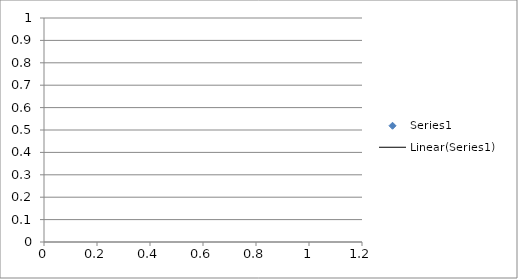
| Category | Series 0 |
|---|---|
|  | 0 |
|  | 1 |
|  | 2 |
|  | 5 |
|  | 10 |
|  | 15 |